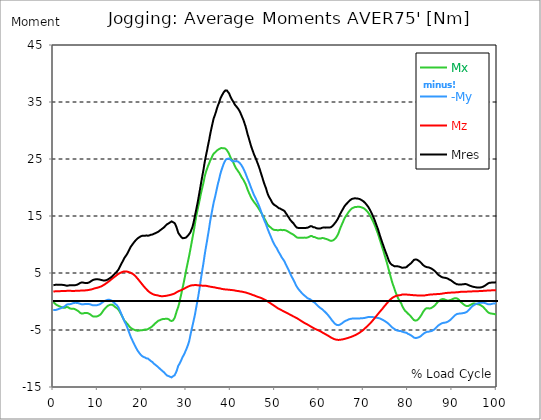
| Category |  Mx |  -My |  Mz |  Mres |
|---|---|---|---|---|
| 0.0 | -0.091 | -1.495 | 1.767 | 2.854 |
| 0.167348456675344 | -0.227 | -1.495 | 1.767 | 2.882 |
| 0.334696913350688 | -0.353 | -1.495 | 1.776 | 2.909 |
| 0.5020453700260321 | -0.471 | -1.486 | 1.785 | 2.945 |
| 0.669393826701376 | -0.58 | -1.468 | 1.785 | 2.963 |
| 0.83674228337672 | -0.652 | -1.423 | 1.794 | 2.945 |
| 1.0040907400520642 | -0.698 | -1.368 | 1.794 | 2.927 |
| 1.1621420602454444 | -0.761 | -1.323 | 1.803 | 2.927 |
| 1.3294905169207885 | -0.834 | -1.278 | 1.812 | 2.936 |
| 1.4968389735961325 | -0.879 | -1.223 | 1.812 | 2.936 |
| 1.6641874302714765 | -0.933 | -1.178 | 1.821 | 2.927 |
| 1.8315358869468206 | -0.979 | -1.124 | 1.821 | 2.927 |
| 1.9988843436221646 | -1.033 | -1.069 | 1.821 | 2.918 |
| 2.1662328002975086 | -1.078 | -1.006 | 1.83 | 2.909 |
| 2.333581256972853 | -1.096 | -0.942 | 1.839 | 2.909 |
| 2.5009297136481967 | -1.105 | -0.879 | 1.839 | 2.891 |
| 2.6682781703235405 | -1.078 | -0.797 | 1.849 | 2.836 |
| 2.8356266269988843 | -0.997 | -0.661 | 1.858 | 2.791 |
| 3.002975083674229 | -0.961 | -0.562 | 1.867 | 2.773 |
| 3.1703235403495724 | -0.979 | -0.507 | 1.867 | 2.782 |
| 3.337671997024917 | -1.015 | -0.471 | 1.867 | 2.791 |
| 3.4957233172182973 | -1.078 | -0.453 | 1.867 | 2.809 |
| 3.663071773893641 | -1.196 | -0.48 | 1.867 | 2.845 |
| 3.8304202305689854 | -1.26 | -0.462 | 1.867 | 2.863 |
| 3.997768687244329 | -1.26 | -0.417 | 1.867 | 2.845 |
| 4.165117143919673 | -1.278 | -0.39 | 1.858 | 2.845 |
| 4.332465600595017 | -1.269 | -0.326 | 1.849 | 2.836 |
| 4.499814057270361 | -1.269 | -0.281 | 1.849 | 2.827 |
| 4.667162513945706 | -1.287 | -0.254 | 1.858 | 2.836 |
| 4.834510970621049 | -1.332 | -0.236 | 1.867 | 2.854 |
| 5.001859427296393 | -1.395 | -0.236 | 1.867 | 2.872 |
| 5.169207883971737 | -1.468 | -0.236 | 1.876 | 2.909 |
| 5.336556340647081 | -1.55 | -0.254 | 1.876 | 2.945 |
| 5.503904797322425 | -1.622 | -0.272 | 1.885 | 2.99 |
| 5.671253253997769 | -1.722 | -0.299 | 1.885 | 3.054 |
| 5.82930457419115 | -1.839 | -0.344 | 1.894 | 3.144 |
| 5.996653030866494 | -1.966 | -0.39 | 1.903 | 3.235 |
| 6.164001487541838 | -2.057 | -0.444 | 1.912 | 3.298 |
| 6.331349944217181 | -2.102 | -0.48 | 1.921 | 3.335 |
| 6.498698400892526 | -2.111 | -0.498 | 1.921 | 3.344 |
| 6.66604685756787 | -2.102 | -0.507 | 1.93 | 3.335 |
| 6.833395314243213 | -2.075 | -0.498 | 1.939 | 3.316 |
| 7.000743770918558 | -2.03 | -0.462 | 1.939 | 3.271 |
| 7.168092227593902 | -2.003 | -0.426 | 1.948 | 3.235 |
| 7.335440684269246 | -2.003 | -0.417 | 1.957 | 3.235 |
| 7.50278914094459 | -2.012 | -0.426 | 1.966 | 3.244 |
| 7.6701375976199335 | -2.021 | -0.417 | 1.984 | 3.244 |
| 7.837486054295278 | -2.057 | -0.426 | 2.003 | 3.271 |
| 7.995537374488658 | -2.12 | -0.435 | 2.03 | 3.326 |
| 8.162885831164003 | -2.184 | -0.453 | 2.048 | 3.389 |
| 8.330234287839346 | -2.265 | -0.498 | 2.075 | 3.48 |
| 8.49758274451469 | -2.365 | -0.553 | 2.102 | 3.57 |
| 8.664931201190035 | -2.483 | -0.607 | 2.138 | 3.652 |
| 8.832279657865378 | -2.583 | -0.661 | 2.175 | 3.733 |
| 8.999628114540721 | -2.637 | -0.68 | 2.22 | 3.797 |
| 9.166976571216066 | -2.637 | -0.671 | 2.265 | 3.842 |
| 9.334325027891412 | -2.628 | -0.671 | 2.311 | 3.869 |
| 9.501673484566755 | -2.628 | -0.68 | 2.347 | 3.878 |
| 9.669021941242098 | -2.637 | -0.671 | 2.374 | 3.896 |
| 9.836370397917442 | -2.619 | -0.643 | 2.401 | 3.905 |
| 10.003718854592787 | -2.573 | -0.607 | 2.428 | 3.896 |
| 10.17106731126813 | -2.492 | -0.571 | 2.474 | 3.887 |
| 10.329118631461512 | -2.438 | -0.535 | 2.519 | 3.869 |
| 10.496467088136853 | -2.356 | -0.471 | 2.555 | 3.842 |
| 10.663815544812199 | -2.247 | -0.39 | 2.61 | 3.806 |
| 10.831164001487544 | -2.084 | -0.299 | 2.664 | 3.77 |
| 10.998512458162887 | -1.912 | -0.199 | 2.727 | 3.733 |
| 11.16586091483823 | -1.722 | -0.1 | 2.8 | 3.706 |
| 11.333209371513574 | -1.513 | 0 | 2.891 | 3.688 |
| 11.50055782818892 | -1.368 | 0.054 | 2.963 | 3.688 |
| 11.667906284864264 | -1.223 | 0.118 | 3.045 | 3.688 |
| 11.835254741539607 | -1.087 | 0.172 | 3.135 | 3.715 |
| 12.00260319821495 | -0.951 | 0.227 | 3.235 | 3.76 |
| 12.169951654890292 | -0.834 | 0.272 | 3.326 | 3.824 |
| 12.337300111565641 | -0.725 | 0.299 | 3.425 | 3.887 |
| 12.504648568240984 | -0.671 | 0.29 | 3.516 | 3.969 |
| 12.662699888434362 | -0.607 | 0.29 | 3.625 | 4.05 |
| 12.830048345109708 | -0.562 | 0.263 | 3.724 | 4.132 |
| 12.997396801785053 | -0.553 | 0.208 | 3.833 | 4.232 |
| 13.164745258460396 | -0.526 | 0.154 | 3.942 | 4.34 |
| 13.33209371513574 | -0.562 | 0.072 | 4.05 | 4.458 |
| 13.499442171811083 | -0.661 | -0.036 | 4.15 | 4.585 |
| 13.666790628486426 | -0.788 | -0.181 | 4.25 | 4.721 |
| 13.834139085161771 | -0.906 | -0.326 | 4.34 | 4.866 |
| 14.001487541837117 | -1.006 | -0.453 | 4.44 | 5.002 |
| 14.16883599851246 | -1.087 | -0.553 | 4.54 | 5.138 |
| 14.336184455187803 | -1.16 | -0.652 | 4.649 | 5.256 |
| 14.503532911863147 | -1.269 | -0.797 | 4.748 | 5.401 |
| 14.670881368538492 | -1.432 | -1.006 | 4.839 | 5.582 |
| 14.828932688731873 | -1.631 | -1.296 | 4.911 | 5.845 |
| 14.996281145407215 | -1.83 | -1.586 | 4.984 | 6.107 |
| 15.163629602082558 | -2.075 | -1.885 | 5.056 | 6.343 |
| 15.330978058757903 | -2.329 | -2.193 | 5.102 | 6.588 |
| 15.498326515433247 | -2.573 | -2.492 | 5.156 | 6.85 |
| 15.665674972108594 | -2.827 | -2.8 | 5.21 | 7.095 |
| 15.833023428783937 | -3.09 | -3.099 | 5.256 | 7.349 |
| 16.00037188545928 | -3.344 | -3.407 | 5.283 | 7.603 |
| 16.167720342134626 | -3.516 | -3.688 | 5.292 | 7.802 |
| 16.335068798809967 | -3.625 | -3.924 | 5.283 | 7.965 |
| 16.502417255485312 | -3.751 | -4.214 | 5.265 | 8.164 |
| 16.669765712160658 | -3.896 | -4.54 | 5.238 | 8.391 |
| 16.837114168836 | -4.069 | -4.893 | 5.201 | 8.636 |
| 17.004462625511344 | -4.232 | -5.247 | 5.156 | 8.889 |
| 17.16251394570472 | -4.395 | -5.6 | 5.12 | 9.152 |
| 17.32986240238007 | -4.54 | -5.944 | 5.074 | 9.406 |
| 17.497210859055414 | -4.667 | -6.289 | 5.02 | 9.65 |
| 17.664559315730756 | -4.739 | -6.56 | 4.948 | 9.823 |
| 17.8319077724061 | -4.803 | -6.832 | 4.884 | 10.004 |
| 17.999256229081443 | -4.875 | -7.104 | 4.793 | 10.185 |
| 18.166604685756788 | -4.948 | -7.376 | 4.694 | 10.348 |
| 18.333953142432133 | -4.993 | -7.657 | 4.585 | 10.52 |
| 18.501301599107478 | -5.029 | -7.902 | 4.458 | 10.665 |
| 18.668650055782823 | -5.074 | -8.137 | 4.313 | 10.81 |
| 18.835998512458165 | -5.111 | -8.382 | 4.168 | 10.946 |
| 19.00334696913351 | -5.129 | -8.608 | 4.014 | 11.064 |
| 19.170695425808855 | -5.093 | -8.79 | 3.869 | 11.146 |
| 19.338043882484197 | -5.093 | -8.98 | 3.697 | 11.245 |
| 19.496095202677576 | -5.074 | -9.143 | 3.534 | 11.327 |
| 19.66344365935292 | -5.056 | -9.297 | 3.371 | 11.408 |
| 19.830792116028263 | -5.047 | -9.433 | 3.208 | 11.472 |
| 19.998140572703612 | -5.047 | -9.551 | 3.045 | 11.517 |
| 20.165489029378953 | -5.02 | -9.623 | 2.891 | 11.517 |
| 20.3328374860543 | -4.993 | -9.723 | 2.727 | 11.544 |
| 20.500185942729644 | -4.938 | -9.768 | 2.573 | 11.526 |
| 20.667534399404985 | -4.911 | -9.823 | 2.428 | 11.517 |
| 20.83488285608033 | -4.938 | -9.904 | 2.283 | 11.562 |
| 21.002231312755672 | -4.938 | -9.977 | 2.148 | 11.599 |
| 21.16957976943102 | -4.902 | -9.995 | 2.003 | 11.562 |
| 21.336928226106362 | -4.848 | -10.013 | 1.876 | 11.535 |
| 21.504276682781704 | -4.766 | -10.113 | 1.749 | 11.553 |
| 21.67162513945705 | -4.676 | -10.23 | 1.64 | 11.599 |
| 21.82967645965043 | -4.612 | -10.366 | 1.568 | 11.68 |
| 21.997024916325774 | -4.54 | -10.448 | 1.486 | 11.716 |
| 22.16437337300112 | -4.449 | -10.493 | 1.405 | 11.698 |
| 22.33172182967646 | -4.331 | -10.611 | 1.332 | 11.744 |
| 22.499070286351806 | -4.205 | -10.783 | 1.269 | 11.825 |
| 22.666418743027148 | -4.087 | -10.892 | 1.214 | 11.88 |
| 22.833767199702496 | -3.96 | -11.001 | 1.169 | 11.925 |
| 23.00111565637784 | -3.815 | -11.1 | 1.142 | 11.97 |
| 23.168464113053183 | -3.715 | -11.2 | 1.124 | 12.034 |
| 23.335812569728528 | -3.606 | -11.309 | 1.105 | 12.106 |
| 23.50316102640387 | -3.471 | -11.454 | 1.087 | 12.197 |
| 23.670509483079215 | -3.371 | -11.526 | 1.042 | 12.233 |
| 23.83785793975456 | -3.344 | -11.653 | 1.006 | 12.342 |
| 23.995909259947936 | -3.298 | -11.78 | 0.97 | 12.45 |
| 24.163257716623285 | -3.226 | -11.88 | 0.942 | 12.523 |
| 24.330606173298627 | -3.162 | -12.006 | 0.933 | 12.632 |
| 24.49795462997397 | -3.117 | -12.124 | 0.924 | 12.731 |
| 24.665303086649313 | -3.081 | -12.233 | 0.924 | 12.831 |
| 24.83265154332466 | -3.072 | -12.342 | 0.933 | 12.931 |
| 25.0 | -3.063 | -12.45 | 0.961 | 13.03 |
| 25.167348456675345 | -3.054 | -12.595 | 0.97 | 13.175 |
| 25.334696913350694 | -3.036 | -12.758 | 0.988 | 13.32 |
| 25.502045370026035 | -3.017 | -12.876 | 1.006 | 13.438 |
| 25.669393826701377 | -3.017 | -12.985 | 1.033 | 13.556 |
| 25.836742283376722 | -3.054 | -13.048 | 1.06 | 13.637 |
| 26.004090740052067 | -3.108 | -13.094 | 1.087 | 13.701 |
| 26.17143919672741 | -3.217 | -13.103 | 1.115 | 13.755 |
| 26.329490516920792 | -3.326 | -13.203 | 1.142 | 13.882 |
| 26.49683897359613 | -3.38 | -13.275 | 1.178 | 14 |
| 26.66418743027148 | -3.425 | -13.32 | 1.223 | 14.054 |
| 26.831535886946828 | -3.434 | -13.266 | 1.26 | 14.036 |
| 26.998884343622166 | -3.307 | -13.103 | 1.296 | 13.909 |
| 27.166232800297514 | -3.181 | -13.067 | 1.35 | 13.891 |
| 27.333581256972852 | -2.909 | -12.958 | 1.395 | 13.773 |
| 27.5009297136482 | -2.537 | -12.695 | 1.477 | 13.547 |
| 27.668278170323543 | -2.111 | -12.441 | 1.559 | 13.248 |
| 27.835626626998888 | -1.676 | -12.142 | 1.649 | 12.913 |
| 28.002975083674233 | -1.314 | -11.716 | 1.713 | 12.487 |
| 28.170323540349575 | -0.961 | -11.3 | 1.776 | 12.07 |
| 28.33767199702492 | -0.489 | -11.082 | 1.83 | 11.861 |
| 28.50502045370026 | 0.045 | -10.865 | 1.876 | 11.68 |
| 28.663071773893645 | 0.671 | -10.602 | 1.939 | 11.508 |
| 28.830420230568986 | 1.223 | -10.321 | 1.984 | 11.336 |
| 28.99776868724433 | 1.858 | -10.013 | 2.057 | 11.218 |
| 29.165117143919673 | 2.438 | -9.714 | 2.129 | 11.1 |
| 29.33246560059502 | 3.008 | -9.524 | 2.175 | 11.118 |
| 29.499814057270367 | 3.652 | -9.27 | 2.247 | 11.137 |
| 29.66716251394571 | 4.295 | -8.971 | 2.32 | 11.164 |
| 29.834510970621054 | 4.984 | -8.663 | 2.401 | 11.182 |
| 30.00185942729639 | 5.663 | -8.373 | 2.474 | 11.245 |
| 30.169207883971744 | 6.28 | -8.037 | 2.528 | 11.39 |
| 30.33655634064708 | 6.914 | -7.702 | 2.592 | 11.535 |
| 30.50390479732243 | 7.521 | -7.313 | 2.655 | 11.689 |
| 30.671253253997772 | 8.137 | -6.869 | 2.709 | 11.861 |
| 30.829304574191156 | 8.835 | -6.216 | 2.764 | 12.034 |
| 30.996653030866494 | 9.524 | -5.591 | 2.8 | 12.305 |
| 31.164001487541842 | 10.23 | -4.984 | 2.827 | 12.659 |
| 31.331349944217187 | 10.955 | -4.458 | 2.845 | 12.967 |
| 31.498698400892525 | 11.644 | -3.869 | 2.854 | 13.42 |
| 31.666046857567874 | 12.342 | -3.271 | 2.863 | 13.982 |
| 31.833395314243212 | 13.103 | -2.7 | 2.882 | 14.589 |
| 32.00074377091856 | 13.909 | -2.057 | 2.891 | 15.269 |
| 32.1680922275939 | 14.661 | -1.296 | 2.882 | 15.885 |
| 32.33544068426925 | 15.332 | -0.598 | 2.872 | 16.528 |
| 32.50278914094459 | 15.984 | 0.118 | 2.854 | 17.171 |
| 32.670137597619934 | 16.582 | 0.825 | 2.836 | 17.86 |
| 32.83748605429528 | 17.199 | 1.622 | 2.827 | 18.594 |
| 33.004834510970625 | 17.815 | 2.428 | 2.818 | 19.328 |
| 33.162885831164004 | 18.467 | 3.316 | 2.809 | 20.089 |
| 33.33023428783935 | 19.092 | 4.186 | 2.8 | 20.85 |
| 33.497582744514695 | 19.654 | 5.011 | 2.782 | 21.575 |
| 33.664931201190036 | 20.198 | 5.836 | 2.773 | 22.291 |
| 33.83227965786538 | 20.742 | 6.606 | 2.773 | 22.962 |
| 33.99962811454073 | 21.385 | 7.476 | 2.773 | 23.777 |
| 34.16697657121607 | 21.992 | 8.346 | 2.773 | 24.547 |
| 34.33432502789141 | 22.509 | 9.143 | 2.773 | 25.245 |
| 34.50167348456676 | 22.907 | 9.886 | 2.755 | 25.87 |
| 34.6690219412421 | 23.279 | 10.62 | 2.718 | 26.487 |
| 34.83637039791744 | 23.659 | 11.436 | 2.691 | 27.166 |
| 35.00371885459279 | 23.995 | 12.197 | 2.655 | 27.8 |
| 35.17106731126814 | 24.276 | 12.994 | 2.619 | 28.426 |
| 35.338415767943474 | 24.629 | 13.891 | 2.61 | 29.169 |
| 35.49646708813686 | 24.91 | 14.634 | 2.592 | 29.812 |
| 35.6638155448122 | 25.173 | 15.323 | 2.564 | 30.401 |
| 35.831164001487544 | 25.454 | 16.012 | 2.537 | 30.999 |
| 35.998512458162885 | 25.716 | 16.7 | 2.519 | 31.579 |
| 36.165860914838234 | 25.943 | 17.371 | 2.501 | 32.114 |
| 36.333209371513576 | 26.061 | 17.878 | 2.483 | 32.467 |
| 36.50055782818892 | 26.16 | 18.422 | 2.456 | 32.839 |
| 36.667906284864266 | 26.26 | 19.002 | 2.419 | 33.228 |
| 36.83525474153961 | 26.432 | 19.618 | 2.392 | 33.69 |
| 37.002603198214956 | 26.568 | 20.207 | 2.365 | 34.098 |
| 37.1699516548903 | 26.641 | 20.787 | 2.347 | 34.479 |
| 37.337300111565646 | 26.686 | 21.24 | 2.329 | 34.76 |
| 37.50464856824098 | 26.786 | 21.811 | 2.302 | 35.176 |
| 37.66269988843437 | 26.867 | 22.355 | 2.283 | 35.566 |
| 37.83004834510971 | 26.922 | 22.817 | 2.256 | 35.874 |
| 37.99739680178505 | 26.912 | 23.215 | 2.211 | 36.119 |
| 38.16474525846039 | 26.903 | 23.596 | 2.184 | 36.345 |
| 38.33209371513574 | 26.912 | 23.967 | 2.166 | 36.59 |
| 38.49944217181109 | 26.903 | 24.285 | 2.148 | 36.78 |
| 38.666790628486424 | 26.858 | 24.575 | 2.129 | 36.934 |
| 38.83413908516178 | 26.804 | 24.783 | 2.111 | 37.034 |
| 39.001487541837115 | 26.704 | 24.973 | 2.093 | 37.088 |
| 39.16883599851246 | 26.523 | 25.055 | 2.093 | 37.007 |
| 39.336184455187805 | 26.314 | 25.037 | 2.084 | 36.826 |
| 39.503532911863154 | 26.115 | 25.091 | 2.075 | 36.699 |
| 39.670881368538495 | 25.852 | 25.082 | 2.066 | 36.49 |
| 39.83822982521384 | 25.526 | 24.982 | 2.039 | 36.164 |
| 39.996281145407224 | 25.218 | 24.865 | 2.021 | 35.847 |
| 40.163629602082565 | 25 | 24.711 | 2.003 | 35.584 |
| 40.33097805875791 | 24.81 | 24.62 | 2.003 | 35.367 |
| 40.498326515433256 | 24.575 | 24.584 | 1.994 | 35.158 |
| 40.6656749721086 | 24.267 | 24.629 | 1.975 | 34.941 |
| 40.83302342878393 | 23.949 | 24.602 | 1.948 | 34.678 |
| 41.00037188545929 | 23.678 | 24.602 | 1.921 | 34.47 |
| 41.16772034213463 | 23.433 | 24.647 | 1.894 | 34.325 |
| 41.33506879880997 | 23.243 | 24.638 | 1.867 | 34.171 |
| 41.50241725548531 | 23.052 | 24.602 | 1.858 | 34.008 |
| 41.66976571216066 | 22.871 | 24.529 | 1.839 | 33.835 |
| 41.837114168836 | 22.699 | 24.439 | 1.812 | 33.636 |
| 42.004462625511344 | 22.49 | 24.33 | 1.785 | 33.41 |
| 42.17181108218669 | 22.246 | 24.194 | 1.767 | 33.138 |
| 42.32986240238007 | 22.01 | 24.031 | 1.749 | 32.857 |
| 42.497210859055414 | 21.766 | 23.823 | 1.731 | 32.531 |
| 42.66455931573076 | 21.584 | 23.596 | 1.704 | 32.232 |
| 42.831907772406105 | 21.385 | 23.369 | 1.676 | 31.932 |
| 42.999256229081446 | 21.168 | 23.089 | 1.64 | 31.57 |
| 43.16660468575679 | 20.896 | 22.799 | 1.613 | 31.171 |
| 43.33395314243214 | 20.66 | 22.509 | 1.586 | 30.791 |
| 43.50130159910748 | 20.325 | 22.164 | 1.559 | 30.31 |
| 43.66865005578282 | 19.971 | 21.838 | 1.513 | 29.821 |
| 43.83599851245817 | 19.6 | 21.494 | 1.468 | 29.314 |
| 44.00334696913351 | 19.292 | 21.195 | 1.423 | 28.888 |
| 44.17069542580886 | 19.002 | 20.868 | 1.377 | 28.453 |
| 44.3380438824842 | 18.712 | 20.533 | 1.341 | 28 |
| 44.49609520267758 | 18.422 | 20.171 | 1.296 | 27.538 |
| 44.66344365935292 | 18.15 | 19.826 | 1.241 | 27.112 |
| 44.83079211602827 | 17.942 | 19.509 | 1.178 | 26.74 |
| 44.99814057270361 | 17.769 | 19.174 | 1.133 | 26.387 |
| 45.16548902937895 | 17.561 | 18.857 | 1.096 | 26.015 |
| 45.332837486054295 | 17.38 | 18.576 | 1.06 | 25.68 |
| 45.500185942729644 | 17.235 | 18.304 | 0.997 | 25.39 |
| 45.66753439940499 | 17.063 | 18.041 | 0.951 | 25.082 |
| 45.83488285608033 | 16.872 | 17.769 | 0.897 | 24.747 |
| 46.00223131275568 | 16.682 | 17.489 | 0.843 | 24.412 |
| 46.16957976943102 | 16.492 | 17.199 | 0.797 | 24.076 |
| 46.336928226106366 | 16.283 | 16.9 | 0.761 | 23.714 |
| 46.50427668278171 | 16.075 | 16.582 | 0.716 | 23.351 |
| 46.671625139457056 | 15.858 | 16.22 | 0.68 | 22.934 |
| 46.829676459650436 | 15.631 | 15.839 | 0.634 | 22.509 |
| 46.99702491632577 | 15.45 | 15.477 | 0.58 | 22.11 |
| 47.16437337300112 | 15.214 | 15.124 | 0.517 | 21.693 |
| 47.33172182967646 | 14.942 | 14.761 | 0.444 | 21.258 |
| 47.49907028635181 | 14.689 | 14.417 | 0.39 | 20.85 |
| 47.66641874302716 | 14.462 | 14.091 | 0.317 | 20.479 |
| 47.83376719970249 | 14.254 | 13.801 | 0.254 | 20.153 |
| 48.001115656377834 | 14.009 | 13.492 | 0.181 | 19.79 |
| 48.16846411305319 | 13.719 | 13.121 | 0.091 | 19.328 |
| 48.33581256972853 | 13.483 | 12.758 | 0.018 | 18.929 |
| 48.50316102640387 | 13.32 | 12.414 | -0.063 | 18.612 |
| 48.67050948307921 | 13.212 | 12.097 | -0.145 | 18.349 |
| 48.837857939754564 | 13.103 | 11.789 | -0.236 | 18.114 |
| 49.005206396429905 | 13.003 | 11.49 | -0.326 | 17.896 |
| 49.163257716623285 | 12.885 | 11.182 | -0.408 | 17.661 |
| 49.33060617329863 | 12.758 | 10.865 | -0.498 | 17.407 |
| 49.49795462997397 | 12.668 | 10.566 | -0.58 | 17.199 |
| 49.66530308664932 | 12.595 | 10.285 | -0.671 | 17.054 |
| 49.832651543324666 | 12.55 | 10.04 | -0.761 | 16.954 |
| 50.0 | 12.541 | 9.814 | -0.843 | 16.872 |
| 50.16734845667534 | 12.541 | 9.605 | -0.933 | 16.8 |
| 50.33469691335069 | 12.541 | 9.424 | -1.024 | 16.736 |
| 50.50204537002604 | 12.505 | 9.197 | -1.115 | 16.61 |
| 50.66939382670139 | 12.478 | 8.926 | -1.196 | 16.474 |
| 50.836742283376715 | 12.478 | 8.681 | -1.26 | 16.374 |
| 51.00409074005207 | 12.541 | 8.463 | -1.332 | 16.347 |
| 51.17143919672741 | 12.559 | 8.237 | -1.395 | 16.311 |
| 51.32949051692079 | 12.577 | 8.028 | -1.468 | 16.283 |
| 51.496838973596134 | 12.523 | 7.766 | -1.531 | 16.138 |
| 51.66418743027148 | 12.514 | 7.575 | -1.604 | 16.075 |
| 51.831535886946824 | 12.55 | 7.394 | -1.667 | 16.03 |
| 51.99888434362217 | 12.55 | 7.195 | -1.74 | 15.939 |
| 52.16623280029752 | 12.55 | 6.986 | -1.803 | 15.839 |
| 52.33358125697285 | 12.496 | 6.687 | -1.876 | 15.631 |
| 52.5009297136482 | 12.459 | 6.443 | -1.939 | 15.468 |
| 52.668278170323546 | 12.387 | 6.162 | -2.012 | 15.259 |
| 52.835626626998895 | 12.305 | 5.89 | -2.075 | 15.033 |
| 53.00297508367424 | 12.242 | 5.645 | -2.138 | 14.861 |
| 53.17032354034958 | 12.17 | 5.373 | -2.211 | 14.67 |
| 53.33767199702492 | 12.079 | 5.065 | -2.274 | 14.453 |
| 53.50502045370027 | 11.988 | 4.793 | -2.338 | 14.263 |
| 53.663071773893655 | 11.925 | 4.531 | -2.41 | 14.109 |
| 53.83042023056899 | 11.852 | 4.268 | -2.483 | 13.964 |
| 53.99776868724433 | 11.798 | 4.032 | -2.555 | 13.846 |
| 54.16511714391967 | 11.735 | 3.797 | -2.619 | 13.719 |
| 54.33246560059503 | 11.626 | 3.507 | -2.682 | 13.52 |
| 54.49981405727037 | 11.544 | 3.253 | -2.737 | 13.366 |
| 54.667162513945705 | 11.399 | 2.972 | -2.818 | 13.166 |
| 54.834510970621054 | 11.291 | 2.718 | -2.891 | 13.021 |
| 55.0018594272964 | 11.218 | 2.501 | -2.954 | 12.94 |
| 55.169207883971744 | 11.182 | 2.311 | -3.036 | 12.913 |
| 55.336556340647086 | 11.164 | 2.129 | -3.117 | 12.903 |
| 55.50390479732243 | 11.155 | 1.975 | -3.208 | 12.885 |
| 55.671253253997776 | 11.164 | 1.821 | -3.289 | 12.894 |
| 55.83860171067312 | 11.2 | 1.676 | -3.371 | 12.913 |
| 55.9966530308665 | 11.2 | 1.522 | -3.452 | 12.903 |
| 56.16400148754184 | 11.191 | 1.386 | -3.534 | 12.894 |
| 56.33134994421718 | 11.191 | 1.26 | -3.616 | 12.903 |
| 56.498698400892536 | 11.209 | 1.16 | -3.706 | 12.922 |
| 56.66604685756788 | 11.209 | 1.033 | -3.779 | 12.913 |
| 56.83339531424321 | 11.2 | 0.924 | -3.842 | 12.922 |
| 57.00074377091856 | 11.182 | 0.816 | -3.905 | 12.913 |
| 57.16809222759391 | 11.191 | 0.689 | -3.969 | 12.922 |
| 57.33544068426925 | 11.227 | 0.589 | -4.041 | 12.949 |
| 57.5027891409446 | 11.254 | 0.517 | -4.123 | 12.976 |
| 57.670137597619934 | 11.327 | 0.471 | -4.195 | 13.058 |
| 57.83748605429528 | 11.408 | 0.417 | -4.277 | 13.157 |
| 58.004834510970625 | 11.472 | 0.353 | -4.349 | 13.221 |
| 58.16288583116401 | 11.508 | 0.272 | -4.422 | 13.248 |
| 58.330234287839346 | 11.472 | 0.127 | -4.504 | 13.184 |
| 58.497582744514695 | 11.408 | 0.036 | -4.576 | 13.121 |
| 58.66493120119004 | 11.327 | -0.072 | -4.649 | 13.012 |
| 58.832279657865385 | 11.318 | -0.145 | -4.712 | 13.012 |
| 58.999628114540734 | 11.291 | -0.227 | -4.784 | 13.003 |
| 59.16697657121607 | 11.236 | -0.362 | -4.848 | 12.949 |
| 59.33432502789142 | 11.164 | -0.517 | -4.911 | 12.867 |
| 59.50167348456676 | 11.118 | -0.643 | -4.966 | 12.831 |
| 59.66902194124211 | 11.073 | -0.761 | -5.02 | 12.804 |
| 59.83637039791745 | 11.046 | -0.888 | -5.083 | 12.804 |
| 60.00371885459278 | 11.037 | -0.997 | -5.138 | 12.804 |
| 60.17106731126813 | 11.037 | -1.096 | -5.201 | 12.804 |
| 60.33841576794349 | 11.064 | -1.205 | -5.274 | 12.831 |
| 60.49646708813685 | 11.1 | -1.296 | -5.346 | 12.885 |
| 60.6638155448122 | 11.137 | -1.368 | -5.428 | 12.949 |
| 60.831164001487544 | 11.137 | -1.495 | -5.5 | 12.985 |
| 60.99851245816289 | 11.109 | -1.613 | -5.573 | 12.985 |
| 61.16586091483824 | 11.064 | -1.731 | -5.645 | 12.967 |
| 61.333209371513576 | 11.01 | -1.858 | -5.718 | 12.958 |
| 61.50055782818892 | 10.973 | -1.984 | -5.79 | 12.967 |
| 61.667906284864266 | 10.946 | -2.12 | -5.863 | 12.985 |
| 61.835254741539615 | 10.919 | -2.265 | -5.935 | 13.003 |
| 62.002603198214956 | 10.847 | -2.419 | -6.008 | 12.994 |
| 62.16995165489029 | 10.783 | -2.583 | -6.089 | 12.985 |
| 62.33730011156564 | 10.702 | -2.746 | -6.171 | 12.976 |
| 62.504648568240995 | 10.638 | -2.918 | -6.261 | 12.994 |
| 62.67199702491633 | 10.638 | -3.09 | -6.334 | 13.058 |
| 62.83004834510971 | 10.638 | -3.28 | -6.406 | 13.148 |
| 62.99739680178505 | 10.692 | -3.425 | -6.47 | 13.266 |
| 63.1647452584604 | 10.756 | -3.57 | -6.533 | 13.402 |
| 63.33209371513575 | 10.847 | -3.751 | -6.588 | 13.565 |
| 63.4994421718111 | 10.955 | -3.896 | -6.633 | 13.719 |
| 63.666790628486424 | 11.1 | -3.987 | -6.669 | 13.891 |
| 63.83413908516177 | 11.281 | -4.06 | -6.696 | 14.072 |
| 64.00148754183712 | 11.49 | -4.123 | -6.715 | 14.272 |
| 64.16883599851248 | 11.707 | -4.159 | -6.733 | 14.48 |
| 64.3361844551878 | 12.006 | -4.15 | -6.742 | 14.734 |
| 64.50353291186315 | 12.378 | -4.105 | -6.733 | 15.024 |
| 64.6708813685385 | 12.731 | -4.05 | -6.715 | 15.296 |
| 64.83822982521384 | 13.058 | -3.978 | -6.696 | 15.54 |
| 65.00557828188919 | 13.357 | -3.887 | -6.678 | 15.776 |
| 65.16362960208257 | 13.656 | -3.797 | -6.66 | 16.012 |
| 65.3309780587579 | 13.946 | -3.697 | -6.633 | 16.229 |
| 65.49832651543326 | 14.272 | -3.588 | -6.597 | 16.474 |
| 65.6656749721086 | 14.562 | -3.489 | -6.56 | 16.7 |
| 65.83302342878395 | 14.788 | -3.407 | -6.533 | 16.854 |
| 66.00037188545929 | 14.988 | -3.362 | -6.497 | 17.017 |
| 66.16772034213463 | 15.178 | -3.316 | -6.461 | 17.153 |
| 66.33506879880998 | 15.368 | -3.262 | -6.425 | 17.289 |
| 66.50241725548531 | 15.568 | -3.19 | -6.379 | 17.434 |
| 66.66976571216065 | 15.758 | -3.126 | -6.343 | 17.561 |
| 66.83711416883601 | 15.921 | -3.081 | -6.298 | 17.688 |
| 67.00446262551135 | 16.075 | -3.054 | -6.252 | 17.806 |
| 67.1718110821867 | 16.22 | -3.017 | -6.216 | 17.914 |
| 67.32986240238007 | 16.329 | -3.008 | -6.162 | 17.987 |
| 67.49721085905541 | 16.401 | -2.999 | -6.107 | 18.032 |
| 67.66455931573076 | 16.456 | -2.981 | -6.044 | 18.05 |
| 67.83190777240611 | 16.519 | -2.963 | -5.999 | 18.087 |
| 67.99925622908145 | 16.564 | -2.972 | -5.935 | 18.105 |
| 68.16660468575678 | 16.573 | -2.981 | -5.881 | 18.105 |
| 68.33395314243214 | 16.591 | -2.972 | -5.808 | 18.087 |
| 68.50130159910749 | 16.591 | -2.963 | -5.736 | 18.059 |
| 68.66865005578282 | 16.61 | -2.972 | -5.663 | 18.05 |
| 68.83599851245816 | 16.61 | -2.972 | -5.582 | 18.023 |
| 69.00334696913352 | 16.619 | -2.972 | -5.509 | 17.996 |
| 69.17069542580886 | 16.61 | -2.972 | -5.428 | 17.96 |
| 69.3380438824842 | 16.564 | -2.954 | -5.328 | 17.878 |
| 69.50539233915956 | 16.519 | -2.945 | -5.238 | 17.806 |
| 69.66344365935292 | 16.474 | -2.936 | -5.147 | 17.724 |
| 69.83079211602826 | 16.428 | -2.927 | -5.047 | 17.643 |
| 69.99814057270362 | 16.365 | -2.909 | -4.938 | 17.543 |
| 70.16548902937896 | 16.265 | -2.9 | -4.821 | 17.416 |
| 70.33283748605429 | 16.175 | -2.863 | -4.685 | 17.289 |
| 70.50018594272964 | 16.066 | -2.836 | -4.558 | 17.153 |
| 70.667534399405 | 15.921 | -2.8 | -4.449 | 16.981 |
| 70.83488285608033 | 15.776 | -2.764 | -4.331 | 16.809 |
| 71.00223131275568 | 15.622 | -2.727 | -4.205 | 16.628 |
| 71.16957976943102 | 15.432 | -2.718 | -4.078 | 16.428 |
| 71.33692822610637 | 15.241 | -2.7 | -3.942 | 16.202 |
| 71.50427668278171 | 15.024 | -2.7 | -3.806 | 15.966 |
| 71.67162513945706 | 14.788 | -2.709 | -3.67 | 15.713 |
| 71.8389735961324 | 14.525 | -2.718 | -3.525 | 15.432 |
| 71.99702491632577 | 14.263 | -2.727 | -3.371 | 15.142 |
| 72.16437337300113 | 13.991 | -2.755 | -3.226 | 14.861 |
| 72.33172182967647 | 13.692 | -2.773 | -3.063 | 14.544 |
| 72.49907028635181 | 13.393 | -2.791 | -2.909 | 14.226 |
| 72.66641874302715 | 13.058 | -2.818 | -2.746 | 13.873 |
| 72.8337671997025 | 12.704 | -2.836 | -2.583 | 13.52 |
| 73.00111565637783 | 12.36 | -2.863 | -2.419 | 13.166 |
| 73.16846411305319 | 12.006 | -2.891 | -2.256 | 12.813 |
| 73.33581256972853 | 11.626 | -2.9 | -2.102 | 12.423 |
| 73.50316102640387 | 11.218 | -2.918 | -1.948 | 12.006 |
| 73.67050948307921 | 10.801 | -2.981 | -1.785 | 11.59 |
| 73.83785793975457 | 10.393 | -3.054 | -1.64 | 11.2 |
| 74.00520639642991 | 9.977 | -3.108 | -1.486 | 10.801 |
| 74.16325771662328 | 9.56 | -3.172 | -1.332 | 10.412 |
| 74.33060617329863 | 9.17 | -3.226 | -1.178 | 10.049 |
| 74.49795462997398 | 8.762 | -3.289 | -1.015 | 9.678 |
| 74.66530308664932 | 8.3 | -3.38 | -0.843 | 9.297 |
| 74.83265154332466 | 7.856 | -3.471 | -0.689 | 8.944 |
| 75.00000000000001 | 7.439 | -3.552 | -0.544 | 8.599 |
| 75.16734845667534 | 7.004 | -3.643 | -0.381 | 8.264 |
| 75.3346969133507 | 6.542 | -3.733 | -0.236 | 7.92 |
| 75.50204537002605 | 6.053 | -3.824 | -0.082 | 7.548 |
| 75.66939382670138 | 5.564 | -3.942 | 0.054 | 7.204 |
| 75.83674228337672 | 5.093 | -4.069 | 0.199 | 6.941 |
| 76.00409074005208 | 4.612 | -4.214 | 0.335 | 6.724 |
| 76.17143919672742 | 4.132 | -4.349 | 0.453 | 6.57 |
| 76.33878765340276 | 3.661 | -4.476 | 0.562 | 6.461 |
| 76.49683897359614 | 3.217 | -4.594 | 0.652 | 6.361 |
| 76.66418743027148 | 2.845 | -4.685 | 0.734 | 6.307 |
| 76.83153588694682 | 2.492 | -4.766 | 0.806 | 6.243 |
| 76.99888434362218 | 2.093 | -4.848 | 0.879 | 6.162 |
| 77.16623280029752 | 1.704 | -4.948 | 0.951 | 6.144 |
| 77.33358125697285 | 1.386 | -5.02 | 0.997 | 6.171 |
| 77.5009297136482 | 1.078 | -5.065 | 1.024 | 6.189 |
| 77.66827817032356 | 0.752 | -5.111 | 1.051 | 6.171 |
| 77.83562662699889 | 0.48 | -5.147 | 1.087 | 6.135 |
| 78.00297508367423 | 0.272 | -5.165 | 1.096 | 6.116 |
| 78.17032354034959 | 0.027 | -5.201 | 1.124 | 6.107 |
| 78.33767199702493 | -0.1 | -5.156 | 1.124 | 6.026 |
| 78.50502045370027 | -0.372 | -5.21 | 1.16 | 5.981 |
| 78.67236891037561 | -0.716 | -5.292 | 1.214 | 5.917 |
| 78.83042023056899 | -0.997 | -5.328 | 1.232 | 5.935 |
| 78.99776868724433 | -1.214 | -5.364 | 1.232 | 5.944 |
| 79.16511714391969 | -1.432 | -5.401 | 1.241 | 5.944 |
| 79.33246560059503 | -1.622 | -5.437 | 1.241 | 5.944 |
| 79.49981405727036 | -1.722 | -5.455 | 1.232 | 5.971 |
| 79.66716251394571 | -1.849 | -5.491 | 1.214 | 6.035 |
| 79.83451097062107 | -1.984 | -5.573 | 1.205 | 6.153 |
| 80.00185942729641 | -2.129 | -5.672 | 1.196 | 6.289 |
| 80.16920788397174 | -2.22 | -5.727 | 1.187 | 6.379 |
| 80.33655634064709 | -2.356 | -5.79 | 1.178 | 6.479 |
| 80.50390479732243 | -2.492 | -5.863 | 1.16 | 6.588 |
| 80.67125325399778 | -2.637 | -5.935 | 1.151 | 6.705 |
| 80.83860171067312 | -2.791 | -6.017 | 1.142 | 6.832 |
| 80.99665303086651 | -2.954 | -6.116 | 1.124 | 6.977 |
| 81.16400148754184 | -3.099 | -6.216 | 1.115 | 7.131 |
| 81.3313499442172 | -3.253 | -6.325 | 1.105 | 7.294 |
| 81.49869840089255 | -3.353 | -6.379 | 1.096 | 7.367 |
| 81.66604685756786 | -3.353 | -6.397 | 1.087 | 7.376 |
| 81.83339531424322 | -3.371 | -6.425 | 1.069 | 7.394 |
| 82.00074377091858 | -3.298 | -6.379 | 1.069 | 7.34 |
| 82.16809222759392 | -3.19 | -6.325 | 1.069 | 7.258 |
| 82.33544068426926 | -3.099 | -6.298 | 1.06 | 7.195 |
| 82.50278914094459 | -2.945 | -6.252 | 1.051 | 7.113 |
| 82.67013759761994 | -2.791 | -6.189 | 1.051 | 7.004 |
| 82.83748605429528 | -2.592 | -6.098 | 1.051 | 6.878 |
| 83.00483451097062 | -2.41 | -6.008 | 1.051 | 6.76 |
| 83.17218296764597 | -2.175 | -5.89 | 1.051 | 6.606 |
| 83.33023428783935 | -1.93 | -5.763 | 1.051 | 6.452 |
| 83.4975827445147 | -1.722 | -5.654 | 1.051 | 6.325 |
| 83.66493120119004 | -1.55 | -5.564 | 1.051 | 6.243 |
| 83.83227965786537 | -1.377 | -5.5 | 1.069 | 6.189 |
| 83.99962811454073 | -1.241 | -5.41 | 1.096 | 6.098 |
| 84.16697657121607 | -1.187 | -5.373 | 1.115 | 6.062 |
| 84.33432502789142 | -1.169 | -5.328 | 1.142 | 6.017 |
| 84.50167348456677 | -1.178 | -5.301 | 1.16 | 5.99 |
| 84.6690219412421 | -1.214 | -5.292 | 1.178 | 5.981 |
| 84.83637039791745 | -1.223 | -5.265 | 1.196 | 5.935 |
| 85.0037188545928 | -1.223 | -5.228 | 1.223 | 5.881 |
| 85.17106731126813 | -1.169 | -5.21 | 1.232 | 5.827 |
| 85.33841576794349 | -1.096 | -5.183 | 1.232 | 5.763 |
| 85.50576422461883 | -1.024 | -5.12 | 1.241 | 5.672 |
| 85.66381554481221 | -0.942 | -5.029 | 1.25 | 5.582 |
| 85.83116400148755 | -0.843 | -4.957 | 1.26 | 5.491 |
| 85.99851245816289 | -0.734 | -4.866 | 1.269 | 5.382 |
| 86.16586091483823 | -0.598 | -4.739 | 1.278 | 5.247 |
| 86.33320937151358 | -0.48 | -4.612 | 1.287 | 5.129 |
| 86.50055782818893 | -0.281 | -4.467 | 1.296 | 4.957 |
| 86.66790628486427 | -0.127 | -4.331 | 1.305 | 4.812 |
| 86.83525474153961 | 0 | -4.214 | 1.314 | 4.694 |
| 87.00260319821496 | 0.091 | -4.114 | 1.323 | 4.594 |
| 87.16995165489031 | 0.172 | -4.032 | 1.332 | 4.504 |
| 87.33730011156564 | 0.281 | -3.96 | 1.341 | 4.422 |
| 87.504648568241 | 0.372 | -3.887 | 1.359 | 4.34 |
| 87.67199702491634 | 0.435 | -3.815 | 1.377 | 4.268 |
| 87.83004834510972 | 0.435 | -3.779 | 1.395 | 4.232 |
| 87.99739680178506 | 0.462 | -3.742 | 1.423 | 4.195 |
| 88.1647452584604 | 0.399 | -3.724 | 1.441 | 4.177 |
| 88.33209371513574 | 0.326 | -3.706 | 1.468 | 4.159 |
| 88.49944217181108 | 0.281 | -3.679 | 1.477 | 4.132 |
| 88.66679062848644 | 0.217 | -3.652 | 1.495 | 4.105 |
| 88.83413908516178 | 0.172 | -3.616 | 1.504 | 4.069 |
| 89.00148754183712 | 0.163 | -3.534 | 1.522 | 4.005 |
| 89.16883599851246 | 0.163 | -3.443 | 1.531 | 3.915 |
| 89.33618445518782 | 0.217 | -3.362 | 1.54 | 3.851 |
| 89.50353291186315 | 0.245 | -3.271 | 1.55 | 3.788 |
| 89.6708813685385 | 0.272 | -3.162 | 1.559 | 3.724 |
| 89.83822982521386 | 0.326 | -3.027 | 1.559 | 3.634 |
| 90.00557828188919 | 0.381 | -2.891 | 1.568 | 3.534 |
| 90.16362960208257 | 0.462 | -2.746 | 1.577 | 3.425 |
| 90.3309780587579 | 0.507 | -2.628 | 1.577 | 3.335 |
| 90.49832651543326 | 0.553 | -2.51 | 1.586 | 3.253 |
| 90.66567497210859 | 0.58 | -2.383 | 1.595 | 3.172 |
| 90.83302342878395 | 0.58 | -2.293 | 1.613 | 3.099 |
| 91.00037188545929 | 0.562 | -2.211 | 1.622 | 3.036 |
| 91.16772034213463 | 0.498 | -2.166 | 1.622 | 3.008 |
| 91.33506879880998 | 0.408 | -2.138 | 1.631 | 2.999 |
| 91.50241725548533 | 0.299 | -2.111 | 1.658 | 2.999 |
| 91.66976571216065 | 0.118 | -2.12 | 1.676 | 2.999 |
| 91.83711416883601 | -0.027 | -2.111 | 1.694 | 2.99 |
| 92.00446262551137 | -0.136 | -2.093 | 1.704 | 2.99 |
| 92.1718110821867 | -0.245 | -2.066 | 1.704 | 2.99 |
| 92.33915953886203 | -0.372 | -2.048 | 1.713 | 3.008 |
| 92.49721085905541 | -0.471 | -2.03 | 1.722 | 3.036 |
| 92.66455931573077 | -0.571 | -2.003 | 1.722 | 3.045 |
| 92.83190777240611 | -0.652 | -1.966 | 1.722 | 3.054 |
| 92.99925622908145 | -0.743 | -1.93 | 1.722 | 3.063 |
| 93.1666046857568 | -0.816 | -1.885 | 1.722 | 3.045 |
| 93.33395314243214 | -0.806 | -1.794 | 1.731 | 2.999 |
| 93.50130159910749 | -0.788 | -1.667 | 1.74 | 2.918 |
| 93.66865005578283 | -0.77 | -1.54 | 1.749 | 2.863 |
| 93.83599851245818 | -0.725 | -1.405 | 1.758 | 2.827 |
| 94.00334696913353 | -0.643 | -1.25 | 1.758 | 2.764 |
| 94.17069542580886 | -0.562 | -1.096 | 1.758 | 2.718 |
| 94.3380438824842 | -0.489 | -0.97 | 1.767 | 2.673 |
| 94.50539233915954 | -0.417 | -0.843 | 1.776 | 2.619 |
| 94.66344365935292 | -0.372 | -0.734 | 1.785 | 2.583 |
| 94.83079211602828 | -0.353 | -0.652 | 1.794 | 2.546 |
| 94.99814057270362 | -0.344 | -0.571 | 1.794 | 2.537 |
| 95.16548902937897 | -0.362 | -0.517 | 1.803 | 2.519 |
| 95.33283748605432 | -0.399 | -0.453 | 1.803 | 2.492 |
| 95.50018594272963 | -0.435 | -0.399 | 1.803 | 2.465 |
| 95.66753439940499 | -0.462 | -0.353 | 1.803 | 2.447 |
| 95.83488285608034 | -0.489 | -0.299 | 1.812 | 2.438 |
| 96.00223131275567 | -0.517 | -0.272 | 1.821 | 2.438 |
| 96.16957976943102 | -0.562 | -0.245 | 1.83 | 2.447 |
| 96.33692822610638 | -0.616 | -0.227 | 1.839 | 2.465 |
| 96.50427668278171 | -0.698 | -0.217 | 1.839 | 2.492 |
| 96.67162513945706 | -0.788 | -0.208 | 1.849 | 2.519 |
| 96.8389735961324 | -0.879 | -0.199 | 1.858 | 2.564 |
| 96.99702491632577 | -0.979 | -0.217 | 1.867 | 2.619 |
| 97.16437337300111 | -1.105 | -0.236 | 1.876 | 2.691 |
| 97.33172182967647 | -1.278 | -0.272 | 1.876 | 2.764 |
| 97.49907028635181 | -1.405 | -0.299 | 1.894 | 2.836 |
| 97.66641874302715 | -1.559 | -0.353 | 1.903 | 2.945 |
| 97.8337671997025 | -1.713 | -0.417 | 1.912 | 3.054 |
| 98.00111565637785 | -1.849 | -0.471 | 1.921 | 3.144 |
| 98.16846411305319 | -1.921 | -0.489 | 1.939 | 3.19 |
| 98.33581256972855 | -2.021 | -0.498 | 1.939 | 3.262 |
| 98.50316102640389 | -2.084 | -0.498 | 1.939 | 3.307 |
| 98.67050948307921 | -2.102 | -0.471 | 1.948 | 3.307 |
| 98.83785793975456 | -2.129 | -0.435 | 1.957 | 3.307 |
| 99.0052063964299 | -2.138 | -0.399 | 1.957 | 3.316 |
| 99.17255485310525 | -2.157 | -0.372 | 1.966 | 3.316 |
| 99.33060617329863 | -2.175 | -0.353 | 1.966 | 3.316 |
| 99.49795462997399 | -2.202 | -0.335 | 1.975 | 3.326 |
| 99.66530308664933 | -2.238 | -0.326 | 1.984 | 3.344 |
| 99.83265154332467 | -2.283 | -0.317 | 1.984 | 3.362 |
| 100.0 | -2.329 | -0.317 | 1.994 | 3.389 |